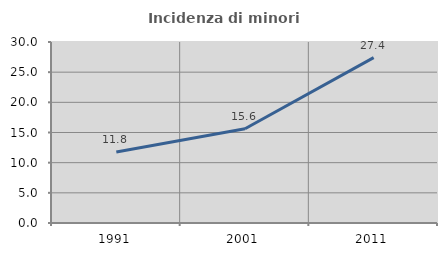
| Category | Incidenza di minori stranieri |
|---|---|
| 1991.0 | 11.765 |
| 2001.0 | 15.625 |
| 2011.0 | 27.402 |